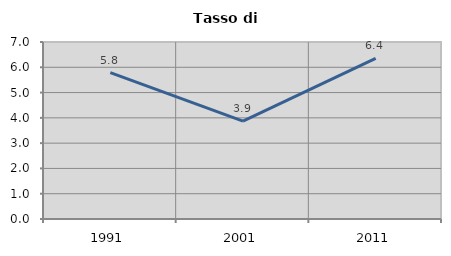
| Category | Tasso di disoccupazione   |
|---|---|
| 1991.0 | 5.792 |
| 2001.0 | 3.871 |
| 2011.0 | 6.353 |